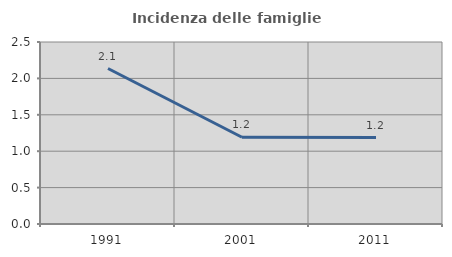
| Category | Incidenza delle famiglie numerose |
|---|---|
| 1991.0 | 2.135 |
| 2001.0 | 1.192 |
| 2011.0 | 1.188 |